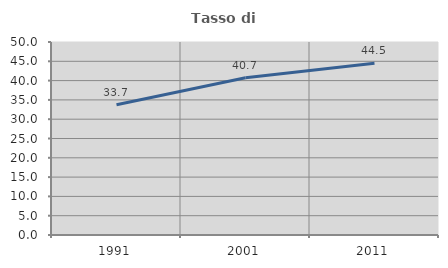
| Category | Tasso di occupazione   |
|---|---|
| 1991.0 | 33.734 |
| 2001.0 | 40.723 |
| 2011.0 | 44.498 |